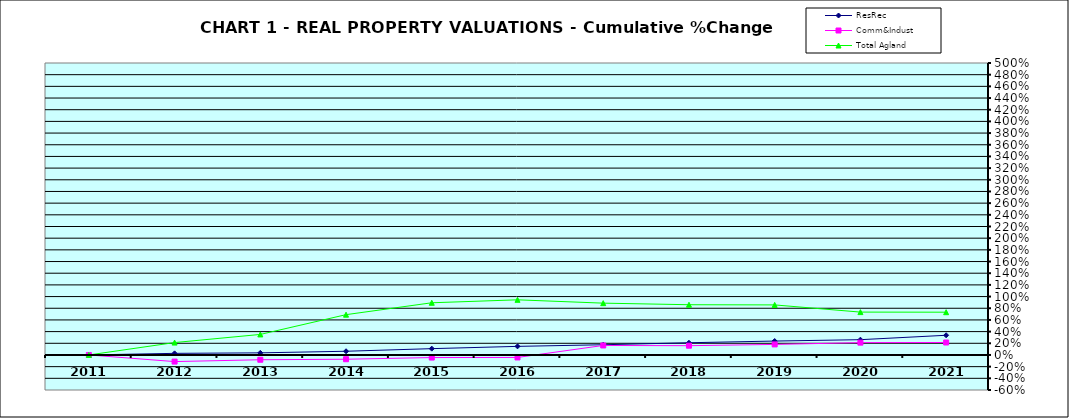
| Category | ResRec | Comm&Indust | Total Agland |
|---|---|---|---|
| 2011.0 | 0 | 0 | 0 |
| 2012.0 | 0.028 | -0.113 | 0.212 |
| 2013.0 | 0.036 | -0.082 | 0.352 |
| 2014.0 | 0.063 | -0.073 | 0.69 |
| 2015.0 | 0.108 | -0.044 | 0.894 |
| 2016.0 | 0.147 | -0.043 | 0.944 |
| 2017.0 | 0.175 | 0.163 | 0.887 |
| 2018.0 | 0.209 | 0.159 | 0.86 |
| 2019.0 | 0.238 | 0.181 | 0.857 |
| 2020.0 | 0.262 | 0.211 | 0.734 |
| 2021.0 | 0.337 | 0.214 | 0.732 |